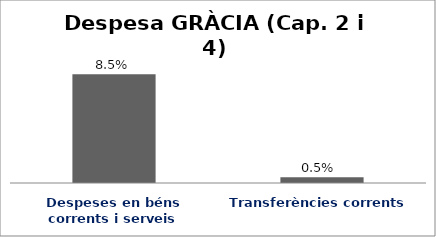
| Category | Series 0 |
|---|---|
| Despeses en béns corrents i serveis | 0.085 |
| Transferències corrents | 0.005 |